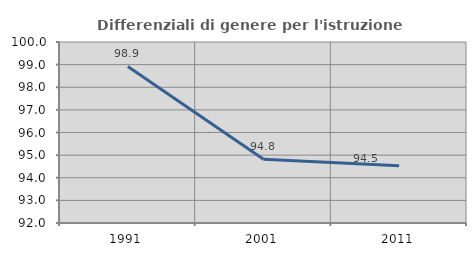
| Category | Differenziali di genere per l'istruzione superiore |
|---|---|
| 1991.0 | 98.919 |
| 2001.0 | 94.82 |
| 2011.0 | 94.526 |